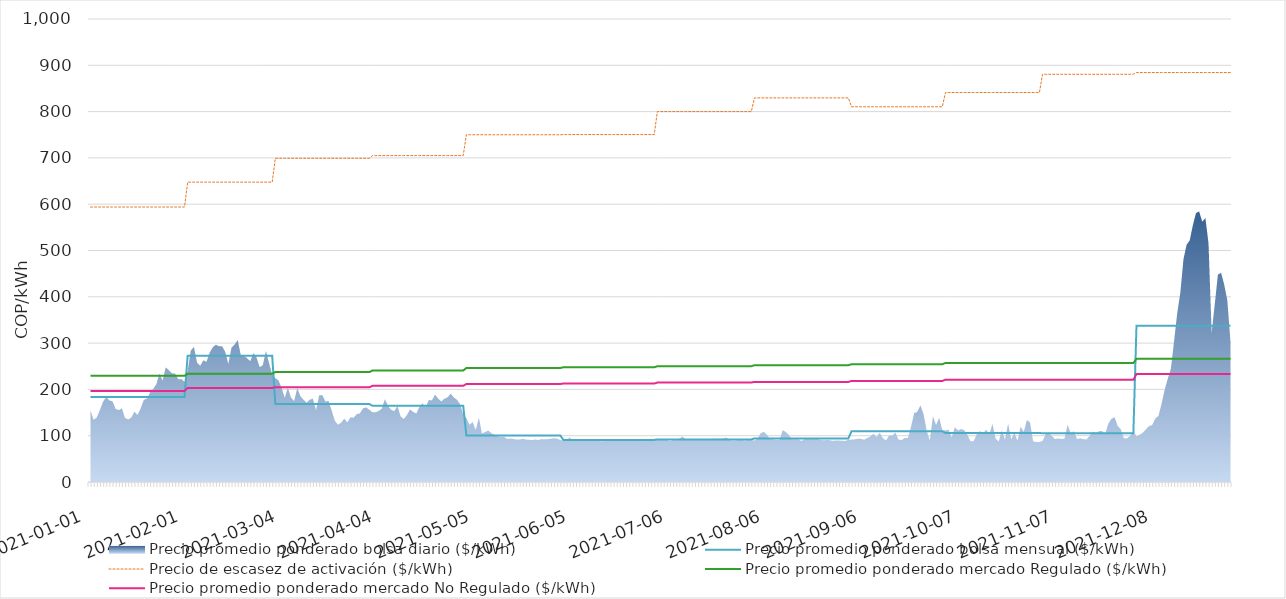
| Category | Precio promedio ponderado bolsa mensual ($/kWh) | Precio de escasez de activación ($/kWh) | Precio promedio ponderado mercado Regulado ($/kWh) | Precio promedio ponderado mercado No Regulado ($/kWh) |
|---|---|---|---|---|
| 2021-01-01 | 183.85 | 593.93 | 229.34 | 196.61 |
| 2021-01-02 | 183.85 | 593.93 | 229.34 | 196.61 |
| 2021-01-03 | 183.85 | 593.93 | 229.34 | 196.61 |
| 2021-01-04 | 183.85 | 593.93 | 229.34 | 196.61 |
| 2021-01-05 | 183.85 | 593.93 | 229.34 | 196.61 |
| 2021-01-06 | 183.85 | 593.93 | 229.34 | 196.61 |
| 2021-01-07 | 183.85 | 593.93 | 229.34 | 196.61 |
| 2021-01-08 | 183.85 | 593.93 | 229.34 | 196.61 |
| 2021-01-09 | 183.85 | 593.93 | 229.34 | 196.61 |
| 2021-01-10 | 183.85 | 593.93 | 229.34 | 196.61 |
| 2021-01-11 | 183.85 | 593.93 | 229.34 | 196.61 |
| 2021-01-12 | 183.85 | 593.93 | 229.34 | 196.61 |
| 2021-01-13 | 183.85 | 593.93 | 229.34 | 196.61 |
| 2021-01-14 | 183.85 | 593.93 | 229.34 | 196.61 |
| 2021-01-15 | 183.85 | 593.93 | 229.34 | 196.61 |
| 2021-01-16 | 183.85 | 593.93 | 229.34 | 196.61 |
| 2021-01-17 | 183.85 | 593.93 | 229.34 | 196.61 |
| 2021-01-18 | 183.85 | 593.93 | 229.34 | 196.61 |
| 2021-01-19 | 183.85 | 593.93 | 229.34 | 196.61 |
| 2021-01-20 | 183.85 | 593.93 | 229.34 | 196.61 |
| 2021-01-21 | 183.85 | 593.93 | 229.34 | 196.61 |
| 2021-01-22 | 183.85 | 593.93 | 229.34 | 196.61 |
| 2021-01-23 | 183.85 | 593.93 | 229.34 | 196.61 |
| 2021-01-24 | 183.85 | 593.93 | 229.34 | 196.61 |
| 2021-01-25 | 183.85 | 593.93 | 229.34 | 196.61 |
| 2021-01-26 | 183.85 | 593.93 | 229.34 | 196.61 |
| 2021-01-27 | 183.85 | 593.93 | 229.34 | 196.61 |
| 2021-01-28 | 183.85 | 593.93 | 229.34 | 196.61 |
| 2021-01-29 | 183.85 | 593.93 | 229.34 | 196.61 |
| 2021-01-30 | 183.85 | 593.93 | 229.34 | 196.61 |
| 2021-01-31 | 183.85 | 593.93 | 229.34 | 196.61 |
| 2021-02-01 | 272.61 | 647.62 | 234.01 | 203.21 |
| 2021-02-02 | 272.61 | 647.62 | 234.01 | 203.21 |
| 2021-02-03 | 272.61 | 647.62 | 234.01 | 203.21 |
| 2021-02-04 | 272.61 | 647.62 | 234.01 | 203.21 |
| 2021-02-05 | 272.61 | 647.62 | 234.01 | 203.21 |
| 2021-02-06 | 272.61 | 647.62 | 234.01 | 203.21 |
| 2021-02-07 | 272.61 | 647.62 | 234.01 | 203.21 |
| 2021-02-08 | 272.61 | 647.62 | 234.01 | 203.21 |
| 2021-02-09 | 272.61 | 647.62 | 234.01 | 203.21 |
| 2021-02-10 | 272.61 | 647.62 | 234.01 | 203.21 |
| 2021-02-11 | 272.61 | 647.62 | 234.01 | 203.21 |
| 2021-02-12 | 272.61 | 647.62 | 234.01 | 203.21 |
| 2021-02-13 | 272.61 | 647.62 | 234.01 | 203.21 |
| 2021-02-14 | 272.61 | 647.62 | 234.01 | 203.21 |
| 2021-02-15 | 272.61 | 647.62 | 234.01 | 203.21 |
| 2021-02-16 | 272.61 | 647.62 | 234.01 | 203.21 |
| 2021-02-17 | 272.61 | 647.62 | 234.01 | 203.21 |
| 2021-02-18 | 272.61 | 647.62 | 234.01 | 203.21 |
| 2021-02-19 | 272.61 | 647.62 | 234.01 | 203.21 |
| 2021-02-20 | 272.61 | 647.62 | 234.01 | 203.21 |
| 2021-02-21 | 272.61 | 647.62 | 234.01 | 203.21 |
| 2021-02-22 | 272.61 | 647.62 | 234.01 | 203.21 |
| 2021-02-23 | 272.61 | 647.62 | 234.01 | 203.21 |
| 2021-02-24 | 272.61 | 647.62 | 234.01 | 203.21 |
| 2021-02-25 | 272.61 | 647.62 | 234.01 | 203.21 |
| 2021-02-26 | 272.61 | 647.62 | 234.01 | 203.21 |
| 2021-02-27 | 272.61 | 647.62 | 234.01 | 203.21 |
| 2021-02-28 | 272.61 | 647.62 | 234.01 | 203.21 |
| 2021-03-01 | 168.66 | 699.14 | 237.4 | 204.63 |
| 2021-03-02 | 168.66 | 699.14 | 237.4 | 204.63 |
| 2021-03-03 | 168.66 | 699.14 | 237.4 | 204.63 |
| 2021-03-04 | 168.66 | 699.14 | 237.4 | 204.63 |
| 2021-03-05 | 168.66 | 699.14 | 237.4 | 204.63 |
| 2021-03-06 | 168.66 | 699.14 | 237.4 | 204.63 |
| 2021-03-07 | 168.66 | 699.14 | 237.4 | 204.63 |
| 2021-03-08 | 168.66 | 699.14 | 237.4 | 204.63 |
| 2021-03-09 | 168.66 | 699.14 | 237.4 | 204.63 |
| 2021-03-10 | 168.66 | 699.14 | 237.4 | 204.63 |
| 2021-03-11 | 168.66 | 699.14 | 237.4 | 204.63 |
| 2021-03-12 | 168.66 | 699.14 | 237.4 | 204.63 |
| 2021-03-13 | 168.66 | 699.14 | 237.4 | 204.63 |
| 2021-03-14 | 168.66 | 699.14 | 237.4 | 204.63 |
| 2021-03-15 | 168.66 | 699.14 | 237.4 | 204.63 |
| 2021-03-16 | 168.66 | 699.14 | 237.4 | 204.63 |
| 2021-03-17 | 168.66 | 699.14 | 237.4 | 204.63 |
| 2021-03-18 | 168.66 | 699.14 | 237.4 | 204.63 |
| 2021-03-19 | 168.66 | 699.14 | 237.4 | 204.63 |
| 2021-03-20 | 168.66 | 699.14 | 237.4 | 204.63 |
| 2021-03-21 | 168.66 | 699.14 | 237.4 | 204.63 |
| 2021-03-22 | 168.66 | 699.14 | 237.4 | 204.63 |
| 2021-03-23 | 168.66 | 699.14 | 237.4 | 204.63 |
| 2021-03-24 | 168.66 | 699.14 | 237.4 | 204.63 |
| 2021-03-25 | 168.66 | 699.14 | 237.4 | 204.63 |
| 2021-03-26 | 168.66 | 699.14 | 237.4 | 204.63 |
| 2021-03-27 | 168.66 | 699.14 | 237.4 | 204.63 |
| 2021-03-28 | 168.66 | 699.14 | 237.4 | 204.63 |
| 2021-03-29 | 168.66 | 699.14 | 237.4 | 204.63 |
| 2021-03-30 | 168.66 | 699.14 | 237.4 | 204.63 |
| 2021-03-31 | 168.66 | 699.14 | 237.4 | 204.63 |
| 2021-04-01 | 164.58 | 704.96 | 240.77 | 207.69 |
| 2021-04-02 | 164.58 | 704.96 | 240.77 | 207.69 |
| 2021-04-03 | 164.58 | 704.96 | 240.77 | 207.69 |
| 2021-04-04 | 164.58 | 704.96 | 240.77 | 207.69 |
| 2021-04-05 | 164.58 | 704.96 | 240.77 | 207.69 |
| 2021-04-06 | 164.58 | 704.96 | 240.77 | 207.69 |
| 2021-04-07 | 164.58 | 704.96 | 240.77 | 207.69 |
| 2021-04-08 | 164.58 | 704.96 | 240.77 | 207.69 |
| 2021-04-09 | 164.58 | 704.96 | 240.77 | 207.69 |
| 2021-04-10 | 164.58 | 704.96 | 240.77 | 207.69 |
| 2021-04-11 | 164.58 | 704.96 | 240.77 | 207.69 |
| 2021-04-12 | 164.58 | 704.96 | 240.77 | 207.69 |
| 2021-04-13 | 164.58 | 704.96 | 240.77 | 207.69 |
| 2021-04-14 | 164.58 | 704.96 | 240.77 | 207.69 |
| 2021-04-15 | 164.58 | 704.96 | 240.77 | 207.69 |
| 2021-04-16 | 164.58 | 704.96 | 240.77 | 207.69 |
| 2021-04-17 | 164.58 | 704.96 | 240.77 | 207.69 |
| 2021-04-18 | 164.58 | 704.96 | 240.77 | 207.69 |
| 2021-04-19 | 164.58 | 704.96 | 240.77 | 207.69 |
| 2021-04-20 | 164.58 | 704.96 | 240.77 | 207.69 |
| 2021-04-21 | 164.58 | 704.96 | 240.77 | 207.69 |
| 2021-04-22 | 164.58 | 704.96 | 240.77 | 207.69 |
| 2021-04-23 | 164.58 | 704.96 | 240.77 | 207.69 |
| 2021-04-24 | 164.58 | 704.96 | 240.77 | 207.69 |
| 2021-04-25 | 164.58 | 704.96 | 240.77 | 207.69 |
| 2021-04-26 | 164.58 | 704.96 | 240.77 | 207.69 |
| 2021-04-27 | 164.58 | 704.96 | 240.77 | 207.69 |
| 2021-04-28 | 164.58 | 704.96 | 240.77 | 207.69 |
| 2021-04-29 | 164.58 | 704.96 | 240.77 | 207.69 |
| 2021-04-30 | 164.58 | 704.96 | 240.77 | 207.69 |
| 2021-05-01 | 100.6 | 749.97 | 246.31 | 211.71 |
| 2021-05-02 | 100.6 | 749.97 | 246.31 | 211.71 |
| 2021-05-03 | 100.6 | 749.97 | 246.31 | 211.71 |
| 2021-05-04 | 100.6 | 749.97 | 246.31 | 211.71 |
| 2021-05-05 | 100.6 | 749.97 | 246.31 | 211.71 |
| 2021-05-06 | 100.6 | 749.97 | 246.31 | 211.71 |
| 2021-05-07 | 100.6 | 749.97 | 246.31 | 211.71 |
| 2021-05-08 | 100.6 | 749.97 | 246.31 | 211.71 |
| 2021-05-09 | 100.6 | 749.97 | 246.31 | 211.71 |
| 2021-05-10 | 100.6 | 749.97 | 246.31 | 211.71 |
| 2021-05-11 | 100.6 | 749.97 | 246.31 | 211.71 |
| 2021-05-12 | 100.6 | 749.97 | 246.31 | 211.71 |
| 2021-05-13 | 100.6 | 749.97 | 246.31 | 211.71 |
| 2021-05-14 | 100.6 | 749.97 | 246.31 | 211.71 |
| 2021-05-15 | 100.6 | 749.97 | 246.31 | 211.71 |
| 2021-05-16 | 100.6 | 749.97 | 246.31 | 211.71 |
| 2021-05-17 | 100.6 | 749.97 | 246.31 | 211.71 |
| 2021-05-18 | 100.6 | 749.97 | 246.31 | 211.71 |
| 2021-05-19 | 100.6 | 749.97 | 246.31 | 211.71 |
| 2021-05-20 | 100.6 | 749.97 | 246.31 | 211.71 |
| 2021-05-21 | 100.6 | 749.97 | 246.31 | 211.71 |
| 2021-05-22 | 100.6 | 749.97 | 246.31 | 211.71 |
| 2021-05-23 | 100.6 | 749.97 | 246.31 | 211.71 |
| 2021-05-24 | 100.6 | 749.97 | 246.31 | 211.71 |
| 2021-05-25 | 100.6 | 749.97 | 246.31 | 211.71 |
| 2021-05-26 | 100.6 | 749.97 | 246.31 | 211.71 |
| 2021-05-27 | 100.6 | 749.97 | 246.31 | 211.71 |
| 2021-05-28 | 100.6 | 749.97 | 246.31 | 211.71 |
| 2021-05-29 | 100.6 | 749.97 | 246.31 | 211.71 |
| 2021-05-30 | 100.6 | 749.97 | 246.31 | 211.71 |
| 2021-05-31 | 100.6 | 749.97 | 246.31 | 211.71 |
| 2021-06-01 | 90.7 | 750.43 | 247.8 | 212.6 |
| 2021-06-02 | 90.7 | 750.43 | 247.8 | 212.6 |
| 2021-06-03 | 90.7 | 750.43 | 247.8 | 212.6 |
| 2021-06-04 | 90.7 | 750.43 | 247.8 | 212.6 |
| 2021-06-05 | 90.7 | 750.43 | 247.8 | 212.6 |
| 2021-06-06 | 90.7 | 750.43 | 247.8 | 212.6 |
| 2021-06-07 | 90.7 | 750.43 | 247.8 | 212.6 |
| 2021-06-08 | 90.7 | 750.43 | 247.8 | 212.6 |
| 2021-06-09 | 90.7 | 750.43 | 247.8 | 212.6 |
| 2021-06-10 | 90.7 | 750.43 | 247.8 | 212.6 |
| 2021-06-11 | 90.7 | 750.43 | 247.8 | 212.6 |
| 2021-06-12 | 90.7 | 750.43 | 247.8 | 212.6 |
| 2021-06-13 | 90.7 | 750.43 | 247.8 | 212.6 |
| 2021-06-14 | 90.7 | 750.43 | 247.8 | 212.6 |
| 2021-06-15 | 90.7 | 750.43 | 247.8 | 212.6 |
| 2021-06-16 | 90.7 | 750.43 | 247.8 | 212.6 |
| 2021-06-17 | 90.7 | 750.43 | 247.8 | 212.6 |
| 2021-06-18 | 90.7 | 750.43 | 247.8 | 212.6 |
| 2021-06-19 | 90.7 | 750.43 | 247.8 | 212.6 |
| 2021-06-20 | 90.7 | 750.43 | 247.8 | 212.6 |
| 2021-06-21 | 90.7 | 750.43 | 247.8 | 212.6 |
| 2021-06-22 | 90.7 | 750.43 | 247.8 | 212.6 |
| 2021-06-23 | 90.7 | 750.43 | 247.8 | 212.6 |
| 2021-06-24 | 90.7 | 750.43 | 247.8 | 212.6 |
| 2021-06-25 | 90.7 | 750.43 | 247.8 | 212.6 |
| 2021-06-26 | 90.7 | 750.43 | 247.8 | 212.6 |
| 2021-06-27 | 90.7 | 750.43 | 247.8 | 212.6 |
| 2021-06-28 | 90.7 | 750.43 | 247.8 | 212.6 |
| 2021-06-29 | 90.7 | 750.43 | 247.8 | 212.6 |
| 2021-06-30 | 90.7 | 750.43 | 247.8 | 212.6 |
| 2021-07-01 | 91.92 | 800.01 | 250.08 | 214.8 |
| 2021-07-02 | 91.92 | 800.01 | 250.08 | 214.8 |
| 2021-07-03 | 91.92 | 800.01 | 250.08 | 214.8 |
| 2021-07-04 | 91.92 | 800.01 | 250.08 | 214.8 |
| 2021-07-05 | 91.92 | 800.01 | 250.08 | 214.8 |
| 2021-07-06 | 91.92 | 800.01 | 250.08 | 214.8 |
| 2021-07-07 | 91.92 | 800.01 | 250.08 | 214.8 |
| 2021-07-08 | 91.92 | 800.01 | 250.08 | 214.8 |
| 2021-07-09 | 91.92 | 800.01 | 250.08 | 214.8 |
| 2021-07-10 | 91.92 | 800.01 | 250.08 | 214.8 |
| 2021-07-11 | 91.92 | 800.01 | 250.08 | 214.8 |
| 2021-07-12 | 91.92 | 800.01 | 250.08 | 214.8 |
| 2021-07-13 | 91.92 | 800.01 | 250.08 | 214.8 |
| 2021-07-14 | 91.92 | 800.01 | 250.08 | 214.8 |
| 2021-07-15 | 91.92 | 800.01 | 250.08 | 214.8 |
| 2021-07-16 | 91.92 | 800.01 | 250.08 | 214.8 |
| 2021-07-17 | 91.92 | 800.01 | 250.08 | 214.8 |
| 2021-07-18 | 91.92 | 800.01 | 250.08 | 214.8 |
| 2021-07-19 | 91.92 | 800.01 | 250.08 | 214.8 |
| 2021-07-20 | 91.92 | 800.01 | 250.08 | 214.8 |
| 2021-07-21 | 91.92 | 800.01 | 250.08 | 214.8 |
| 2021-07-22 | 91.92 | 800.01 | 250.08 | 214.8 |
| 2021-07-23 | 91.92 | 800.01 | 250.08 | 214.8 |
| 2021-07-24 | 91.92 | 800.01 | 250.08 | 214.8 |
| 2021-07-25 | 91.92 | 800.01 | 250.08 | 214.8 |
| 2021-07-26 | 91.92 | 800.01 | 250.08 | 214.8 |
| 2021-07-27 | 91.92 | 800.01 | 250.08 | 214.8 |
| 2021-07-28 | 91.92 | 800.01 | 250.08 | 214.8 |
| 2021-07-29 | 91.92 | 800.01 | 250.08 | 214.8 |
| 2021-07-30 | 91.92 | 800.01 | 250.08 | 214.8 |
| 2021-07-31 | 91.92 | 800.01 | 250.08 | 214.8 |
| 2021-08-01 | 94.21 | 829.59 | 252.24 | 216.11 |
| 2021-08-02 | 94.21 | 829.59 | 252.24 | 216.11 |
| 2021-08-03 | 94.21 | 829.59 | 252.24 | 216.11 |
| 2021-08-04 | 94.21 | 829.59 | 252.24 | 216.11 |
| 2021-08-05 | 94.21 | 829.59 | 252.24 | 216.11 |
| 2021-08-06 | 94.21 | 829.59 | 252.24 | 216.11 |
| 2021-08-07 | 94.21 | 829.59 | 252.24 | 216.11 |
| 2021-08-08 | 94.21 | 829.59 | 252.24 | 216.11 |
| 2021-08-09 | 94.21 | 829.59 | 252.24 | 216.11 |
| 2021-08-10 | 94.21 | 829.59 | 252.24 | 216.11 |
| 2021-08-11 | 94.21 | 829.59 | 252.24 | 216.11 |
| 2021-08-12 | 94.21 | 829.59 | 252.24 | 216.11 |
| 2021-08-13 | 94.21 | 829.59 | 252.24 | 216.11 |
| 2021-08-14 | 94.21 | 829.59 | 252.24 | 216.11 |
| 2021-08-15 | 94.21 | 829.59 | 252.24 | 216.11 |
| 2021-08-16 | 94.21 | 829.59 | 252.24 | 216.11 |
| 2021-08-17 | 94.21 | 829.59 | 252.24 | 216.11 |
| 2021-08-18 | 94.21 | 829.59 | 252.24 | 216.11 |
| 2021-08-19 | 94.21 | 829.59 | 252.24 | 216.11 |
| 2021-08-20 | 94.21 | 829.59 | 252.24 | 216.11 |
| 2021-08-21 | 94.21 | 829.59 | 252.24 | 216.11 |
| 2021-08-22 | 94.21 | 829.59 | 252.24 | 216.11 |
| 2021-08-23 | 94.21 | 829.59 | 252.24 | 216.11 |
| 2021-08-24 | 94.21 | 829.59 | 252.24 | 216.11 |
| 2021-08-25 | 94.21 | 829.59 | 252.24 | 216.11 |
| 2021-08-26 | 94.21 | 829.59 | 252.24 | 216.11 |
| 2021-08-27 | 94.21 | 829.59 | 252.24 | 216.11 |
| 2021-08-28 | 94.21 | 829.59 | 252.24 | 216.11 |
| 2021-08-29 | 94.21 | 829.59 | 252.24 | 216.11 |
| 2021-08-30 | 94.21 | 829.59 | 252.24 | 216.11 |
| 2021-08-31 | 94.21 | 829.59 | 252.24 | 216.11 |
| 2021-09-01 | 109.6 | 810.47 | 254.28 | 218.26 |
| 2021-09-02 | 109.6 | 810.47 | 254.28 | 218.26 |
| 2021-09-03 | 109.6 | 810.47 | 254.28 | 218.26 |
| 2021-09-04 | 109.6 | 810.47 | 254.28 | 218.26 |
| 2021-09-05 | 109.6 | 810.47 | 254.28 | 218.26 |
| 2021-09-06 | 109.6 | 810.47 | 254.28 | 218.26 |
| 2021-09-07 | 109.6 | 810.47 | 254.28 | 218.26 |
| 2021-09-08 | 109.6 | 810.47 | 254.28 | 218.26 |
| 2021-09-09 | 109.6 | 810.47 | 254.28 | 218.26 |
| 2021-09-10 | 109.6 | 810.47 | 254.28 | 218.26 |
| 2021-09-11 | 109.6 | 810.47 | 254.28 | 218.26 |
| 2021-09-12 | 109.6 | 810.47 | 254.28 | 218.26 |
| 2021-09-13 | 109.6 | 810.47 | 254.28 | 218.26 |
| 2021-09-14 | 109.6 | 810.47 | 254.28 | 218.26 |
| 2021-09-15 | 109.6 | 810.47 | 254.28 | 218.26 |
| 2021-09-16 | 109.6 | 810.47 | 254.28 | 218.26 |
| 2021-09-17 | 109.6 | 810.47 | 254.28 | 218.26 |
| 2021-09-18 | 109.6 | 810.47 | 254.28 | 218.26 |
| 2021-09-19 | 109.6 | 810.47 | 254.28 | 218.26 |
| 2021-09-20 | 109.6 | 810.47 | 254.28 | 218.26 |
| 2021-09-21 | 109.6 | 810.47 | 254.28 | 218.26 |
| 2021-09-22 | 109.6 | 810.47 | 254.28 | 218.26 |
| 2021-09-23 | 109.6 | 810.47 | 254.28 | 218.26 |
| 2021-09-24 | 109.6 | 810.47 | 254.28 | 218.26 |
| 2021-09-25 | 109.6 | 810.47 | 254.28 | 218.26 |
| 2021-09-26 | 109.6 | 810.47 | 254.28 | 218.26 |
| 2021-09-27 | 109.6 | 810.47 | 254.28 | 218.26 |
| 2021-09-28 | 109.6 | 810.47 | 254.28 | 218.26 |
| 2021-09-29 | 109.6 | 810.47 | 254.28 | 218.26 |
| 2021-09-30 | 109.6 | 810.47 | 254.28 | 218.26 |
| 2021-10-01 | 105.68 | 841.26 | 257.23 | 220.94 |
| 2021-10-02 | 105.68 | 841.26 | 257.23 | 220.94 |
| 2021-10-03 | 105.68 | 841.26 | 257.23 | 220.94 |
| 2021-10-04 | 105.68 | 841.26 | 257.23 | 220.94 |
| 2021-10-05 | 105.68 | 841.26 | 257.23 | 220.94 |
| 2021-10-06 | 105.68 | 841.26 | 257.23 | 220.94 |
| 2021-10-07 | 105.68 | 841.26 | 257.23 | 220.94 |
| 2021-10-08 | 105.68 | 841.26 | 257.23 | 220.94 |
| 2021-10-09 | 105.68 | 841.26 | 257.23 | 220.94 |
| 2021-10-10 | 105.68 | 841.26 | 257.23 | 220.94 |
| 2021-10-11 | 105.68 | 841.26 | 257.23 | 220.94 |
| 2021-10-12 | 105.68 | 841.26 | 257.23 | 220.94 |
| 2021-10-13 | 105.68 | 841.26 | 257.23 | 220.94 |
| 2021-10-14 | 105.68 | 841.26 | 257.23 | 220.94 |
| 2021-10-15 | 105.68 | 841.26 | 257.23 | 220.94 |
| 2021-10-16 | 105.68 | 841.26 | 257.23 | 220.94 |
| 2021-10-17 | 105.68 | 841.26 | 257.23 | 220.94 |
| 2021-10-18 | 105.68 | 841.26 | 257.23 | 220.94 |
| 2021-10-19 | 105.68 | 841.26 | 257.23 | 220.94 |
| 2021-10-20 | 105.68 | 841.26 | 257.23 | 220.94 |
| 2021-10-21 | 105.68 | 841.26 | 257.23 | 220.94 |
| 2021-10-22 | 105.68 | 841.26 | 257.23 | 220.94 |
| 2021-10-23 | 105.68 | 841.26 | 257.23 | 220.94 |
| 2021-10-24 | 105.68 | 841.26 | 257.23 | 220.94 |
| 2021-10-25 | 105.68 | 841.26 | 257.23 | 220.94 |
| 2021-10-26 | 105.68 | 841.26 | 257.23 | 220.94 |
| 2021-10-27 | 105.68 | 841.26 | 257.23 | 220.94 |
| 2021-10-28 | 105.68 | 841.26 | 257.23 | 220.94 |
| 2021-10-29 | 105.68 | 841.26 | 257.23 | 220.94 |
| 2021-10-30 | 105.68 | 841.26 | 257.23 | 220.94 |
| 2021-10-31 | 105.68 | 841.26 | 257.23 | 220.94 |
| 2021-11-01 | 105.45 | 880.6 | 256.96 | 220.9 |
| 2021-11-02 | 105.45 | 880.6 | 256.96 | 220.9 |
| 2021-11-03 | 105.45 | 880.6 | 256.96 | 220.9 |
| 2021-11-04 | 105.45 | 880.6 | 256.96 | 220.9 |
| 2021-11-05 | 105.45 | 880.6 | 256.96 | 220.9 |
| 2021-11-06 | 105.45 | 880.6 | 256.96 | 220.9 |
| 2021-11-07 | 105.45 | 880.6 | 256.96 | 220.9 |
| 2021-11-08 | 105.45 | 880.6 | 256.96 | 220.9 |
| 2021-11-09 | 105.45 | 880.6 | 256.96 | 220.9 |
| 2021-11-10 | 105.45 | 880.6 | 256.96 | 220.9 |
| 2021-11-11 | 105.45 | 880.6 | 256.96 | 220.9 |
| 2021-11-12 | 105.45 | 880.6 | 256.96 | 220.9 |
| 2021-11-13 | 105.45 | 880.6 | 256.96 | 220.9 |
| 2021-11-14 | 105.45 | 880.6 | 256.96 | 220.9 |
| 2021-11-15 | 105.45 | 880.6 | 256.96 | 220.9 |
| 2021-11-16 | 105.45 | 880.6 | 256.96 | 220.9 |
| 2021-11-17 | 105.45 | 880.6 | 256.96 | 220.9 |
| 2021-11-18 | 105.45 | 880.6 | 256.96 | 220.9 |
| 2021-11-19 | 105.45 | 880.6 | 256.96 | 220.9 |
| 2021-11-20 | 105.45 | 880.6 | 256.96 | 220.9 |
| 2021-11-21 | 105.45 | 880.6 | 256.96 | 220.9 |
| 2021-11-22 | 105.45 | 880.6 | 256.96 | 220.9 |
| 2021-11-23 | 105.45 | 880.6 | 256.96 | 220.9 |
| 2021-11-24 | 105.45 | 880.6 | 256.96 | 220.9 |
| 2021-11-25 | 105.45 | 880.6 | 256.96 | 220.9 |
| 2021-11-26 | 105.45 | 880.6 | 256.96 | 220.9 |
| 2021-11-27 | 105.45 | 880.6 | 256.96 | 220.9 |
| 2021-11-28 | 105.45 | 880.6 | 256.96 | 220.9 |
| 2021-11-29 | 105.45 | 880.6 | 256.96 | 220.9 |
| 2021-11-30 | 105.45 | 880.6 | 256.96 | 220.9 |
| 2021-12-01 | 337.61 | 884.38 | 266.1 | 233 |
| 2021-12-02 | 337.61 | 884.38 | 266.1 | 233 |
| 2021-12-03 | 337.61 | 884.38 | 266.1 | 233 |
| 2021-12-04 | 337.61 | 884.38 | 266.1 | 233 |
| 2021-12-05 | 337.61 | 884.38 | 266.1 | 233 |
| 2021-12-06 | 337.61 | 884.38 | 266.1 | 233 |
| 2021-12-07 | 337.61 | 884.38 | 266.1 | 233 |
| 2021-12-08 | 337.61 | 884.38 | 266.1 | 233 |
| 2021-12-09 | 337.61 | 884.38 | 266.1 | 233 |
| 2021-12-10 | 337.61 | 884.38 | 266.1 | 233 |
| 2021-12-11 | 337.61 | 884.38 | 266.1 | 233 |
| 2021-12-12 | 337.61 | 884.38 | 266.1 | 233 |
| 2021-12-13 | 337.61 | 884.38 | 266.1 | 233 |
| 2021-12-14 | 337.61 | 884.38 | 266.1 | 233 |
| 2021-12-15 | 337.61 | 884.38 | 266.1 | 233 |
| 2021-12-16 | 337.61 | 884.38 | 266.1 | 233 |
| 2021-12-17 | 337.61 | 884.38 | 266.1 | 233 |
| 2021-12-18 | 337.61 | 884.38 | 266.1 | 233 |
| 2021-12-19 | 337.61 | 884.38 | 266.1 | 233 |
| 2021-12-20 | 337.61 | 884.38 | 266.1 | 233 |
| 2021-12-21 | 337.61 | 884.38 | 266.1 | 233 |
| 2021-12-22 | 337.61 | 884.38 | 266.1 | 233 |
| 2021-12-23 | 337.61 | 884.38 | 266.1 | 233 |
| 2021-12-24 | 337.61 | 884.38 | 266.1 | 233 |
| 2021-12-25 | 337.61 | 884.38 | 266.1 | 233 |
| 2021-12-26 | 337.61 | 884.38 | 266.1 | 233 |
| 2021-12-27 | 337.61 | 884.38 | 266.1 | 233 |
| 2021-12-28 | 337.61 | 884.38 | 266.1 | 233 |
| 2021-12-29 | 337.61 | 884.38 | 266.1 | 233 |
| 2021-12-30 | 337.61 | 884.38 | 266.1 | 233 |
| 2021-12-31 | 337.61 | 884.38 | 266.1 | 233 |